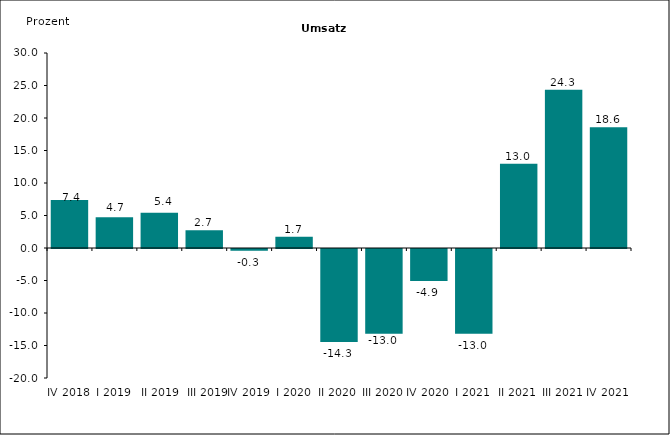
| Category | Series 0 |
|---|---|
| IV 2018 | 7.4 |
| I 2019 | 4.714 |
|  II 2019 | 5.422 |
|  III 2019 | 2.73 |
| IV 2019 | -0.265 |
| I 2020 | 1.721 |
| II 2020 | -14.324 |
| III 2020 | -13.033 |
| IV 2020 | -4.938 |
| I 2021 | -13.038 |
| II 2021 | 12.95 |
| III 2021 | 24.338 |
| IV 2021 | 18.572 |